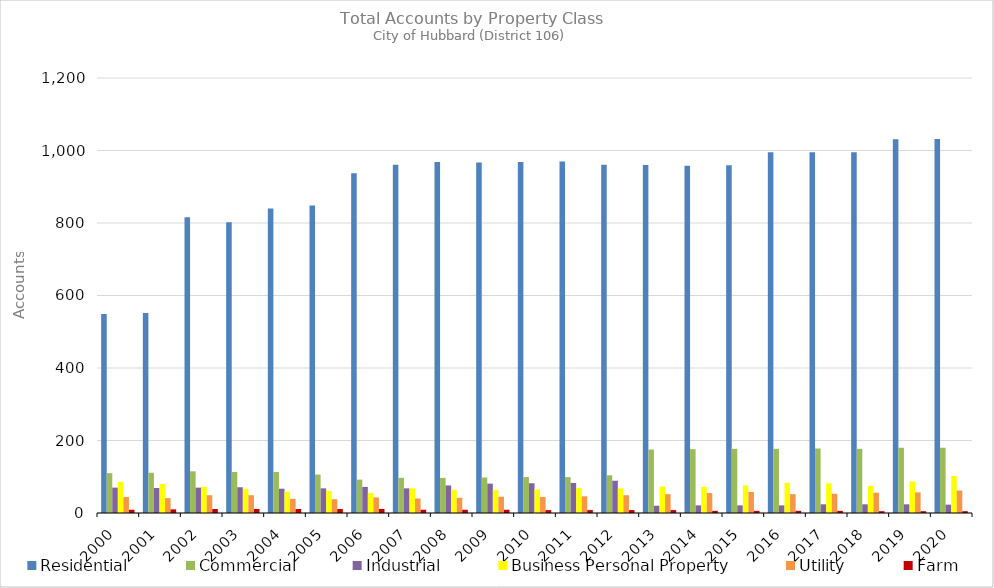
| Category | Residential | Commercial | Industrial | Business Personal Property | Utility | Farm |
|---|---|---|---|---|---|---|
| 2000.0 | 549 | 110 | 70 | 86 | 44 | 9 |
| 2001.0 | 552 | 111 | 69 | 80 | 41 | 10 |
| 2002.0 | 816 | 115 | 70 | 72 | 49 | 11 |
| 2003.0 | 802 | 113 | 71 | 67 | 49 | 11 |
| 2004.0 | 840 | 113 | 67 | 59 | 39 | 11 |
| 2005.0 | 848 | 106 | 68 | 61 | 38 | 11 |
| 2006.0 | 937 | 92 | 72 | 55 | 43 | 11 |
| 2007.0 | 961 | 97 | 68 | 68 | 40 | 9 |
| 2008.0 | 968 | 97 | 76 | 64 | 42 | 9 |
| 2009.0 | 967 | 98 | 81 | 64 | 45 | 9 |
| 2010.0 | 968 | 99 | 82 | 65 | 44 | 8 |
| 2011.0 | 970 | 99 | 83 | 69 | 46 | 8 |
| 2012.0 | 961 | 104 | 89 | 68 | 49 | 8 |
| 2013.0 | 960 | 175 | 20 | 73 | 52 | 8 |
| 2014.0 | 958 | 176 | 21 | 72 | 55 | 6 |
| 2015.0 | 959 | 177 | 21 | 76 | 58 | 6 |
| 2016.0 | 995 | 177 | 21 | 83 | 52 | 6 |
| 2017.0 | 995 | 178 | 24 | 82 | 53 | 6 |
| 2018.0 | 995 | 177 | 24 | 75 | 56 | 5 |
| 2019.0 | 1031 | 180 | 24 | 87 | 57 | 5 |
| 2020.0 | 1032 | 180 | 23 | 102 | 62 | 5 |